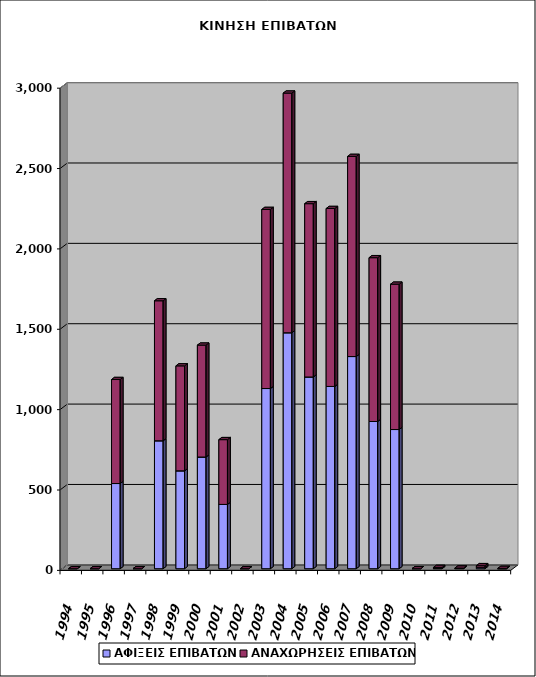
| Category | ΑΦΙΞΕΙΣ ΕΠΙΒΑΤΩΝ | ΑΝΑΧΩΡΗΣΕΙΣ ΕΠΙΒΑΤΩΝ |
|---|---|---|
| 1994.0 | 0 | 0 |
| 1995.0 | 0 | 0 |
| 1996.0 | 530 | 647 |
| 1997.0 | 0 | 0 |
| 1998.0 | 796 | 871 |
| 1999.0 | 609 | 653 |
| 2000.0 | 695 | 696 |
| 2001.0 | 400 | 403 |
| 2002.0 | 0 | 0 |
| 2003.0 | 1121 | 1114 |
| 2004.0 | 1468 | 1491 |
| 2005.0 | 1193 | 1078 |
| 2006.0 | 1134 | 1107 |
| 2007.0 | 1320 | 1245 |
| 2008.0 | 916 | 1019 |
| 2009.0 | 866 | 904 |
| 2010.0 | 0 | 0 |
| 2011.0 | 4 | 4 |
| 2012.0 | 2 | 2 |
| 2013.0 | 9 | 10 |
| 2014.0 | 0 | 2 |